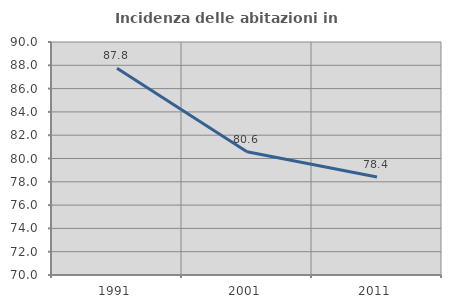
| Category | Incidenza delle abitazioni in proprietà  |
|---|---|
| 1991.0 | 87.755 |
| 2001.0 | 80.577 |
| 2011.0 | 78.419 |